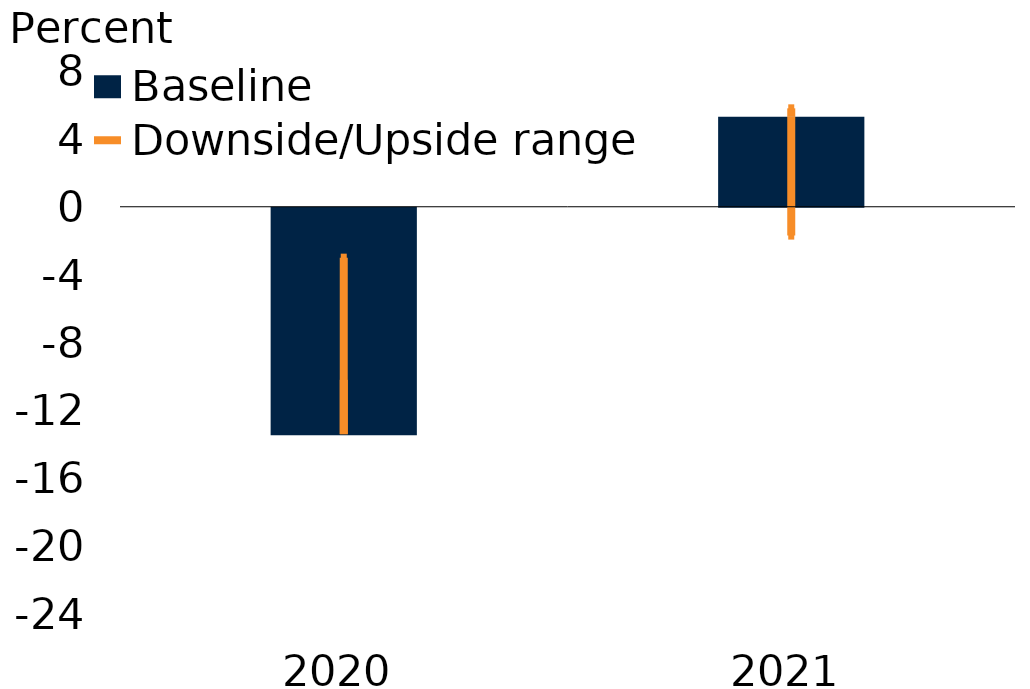
| Category | Baseline |
|---|---|
| 2020.0 | -13.4 |
| 2021.0 | 5.3 |